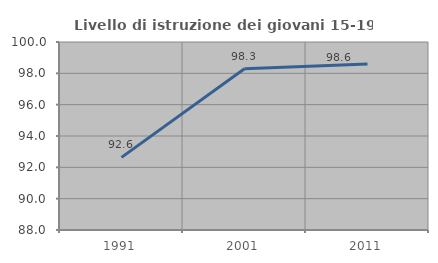
| Category | Livello di istruzione dei giovani 15-19 anni |
|---|---|
| 1991.0 | 92.636 |
| 2001.0 | 98.293 |
| 2011.0 | 98.596 |